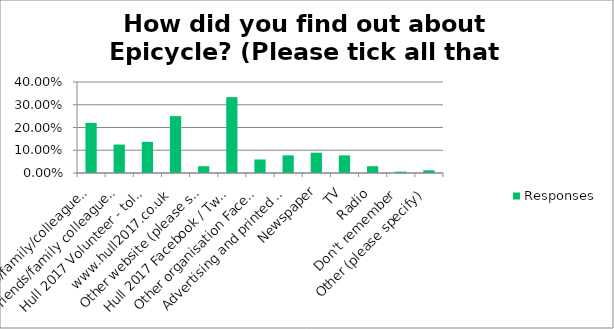
| Category | Responses |
|---|---|
| Friends/family/colleagues - told me in person | 0.22 |
| Friends/family colleagues – via social media / email | 0.125 |
| Hull 2017 Volunteer - told me or via social media / email | 0.137 |
| www.hull2017.co.uk | 0.25 |
| Other website (please specify) | 0.03 |
| Hull 2017 Facebook / Twitter / Instagram / Youtube / Flickr / e-newsletter | 0.333 |
| Other organisation Facebook / Twitter / Instagram / YouTube / Flickr (please specify) | 0.06 |
| Advertising and printed promotional material (e.g. brochure, leaflet, flyer, billboard, poster) | 0.077 |
| Newspaper | 0.089 |
| TV | 0.077 |
| Radio | 0.03 |
| Don't remember | 0.006 |
| Other (please specify) | 0.012 |